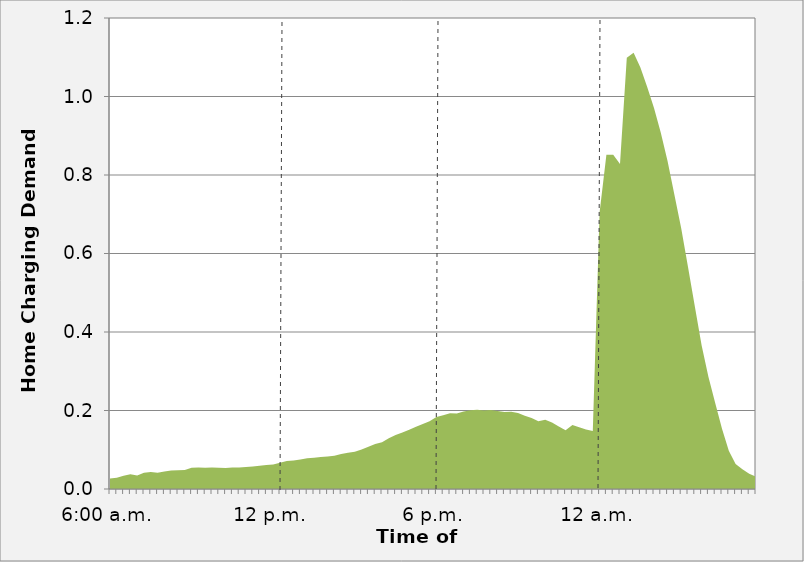
| Category | Total Home Charging Demand (Megawatts) |
|---|---|
| 6:00 a.m. | 0.027 |
| 6:15 | 0.029 |
| 6:30 | 0.034 |
| 6:45 | 0.038 |
| 7:00 | 0.035 |
| 7:15 | 0.041 |
| 7:30 | 0.043 |
| 7:45 | 0.041 |
| 8:00 | 0.045 |
| 8:15 | 0.047 |
| 8:30 | 0.048 |
| 8:45 | 0.049 |
| 9:00 | 0.054 |
| 9:15 | 0.055 |
| 9:30 | 0.054 |
| 9:45 | 0.055 |
| 10:00 | 0.054 |
| 10:15 | 0.053 |
| 10:30 | 0.055 |
| 10:45 | 0.055 |
| 11:00 | 0.056 |
| 11:15 | 0.058 |
| 11:30 | 0.059 |
| 11:45 | 0.061 |
| 12 p.m. | 0.062 |
| 12:15 | 0.067 |
| 12:30 | 0.071 |
| 12:45 | 0.073 |
| 13:00 | 0.075 |
| 13:15 | 0.078 |
| 13:30 | 0.079 |
| 13:45 | 0.082 |
| 14:00 | 0.083 |
| 14:15 | 0.085 |
| 14:30 | 0.089 |
| 14:45 | 0.092 |
| 15:00 | 0.095 |
| 15:15 | 0.101 |
| 15:30 | 0.108 |
| 15:45 | 0.115 |
| 16:00 | 0.119 |
| 16:15 | 0.129 |
| 16:30 | 0.138 |
| 16:45 | 0.144 |
| 17:00 | 0.151 |
| 17:15 | 0.159 |
| 17:30 | 0.166 |
| 17:45 | 0.173 |
| 6 p.m. | 0.183 |
| 18:15 | 0.188 |
| 18:30 | 0.193 |
| 18:45 | 0.192 |
| 19:00 | 0.198 |
| 19:15 | 0.201 |
| 19:30 | 0.202 |
| 19:45 | 0.2 |
| 20:00 | 0.201 |
| 20:15 | 0.198 |
| 20:30 | 0.196 |
| 20:45 | 0.197 |
| 21:00 | 0.193 |
| 21:15 | 0.186 |
| 21:30 | 0.181 |
| 21:45 | 0.172 |
| 22:00 | 0.176 |
| 22:15 | 0.169 |
| 22:30 | 0.159 |
| 22:45 | 0.15 |
| 23:00 | 0.163 |
| 23:15 | 0.157 |
| 23:30 | 0.152 |
| 23:45 | 0.147 |
| 12 a.m. | 0.705 |
| 0:15 | 0.851 |
| 0:30 | 0.851 |
| 0:45 | 0.828 |
| 1:00 | 1.099 |
| 1:15 | 1.111 |
| 1:30 | 1.074 |
| 1:45 | 1.024 |
| 2:00 | 0.971 |
| 2:15 | 0.907 |
| 2:30 | 0.835 |
| 2:45 | 0.75 |
| 3:00 | 0.665 |
| 3:15 | 0.566 |
| 3:30 | 0.465 |
| 3:45 | 0.366 |
| 4:00 | 0.286 |
| 4:15 | 0.219 |
| 4:30 | 0.153 |
| 4:45 | 0.097 |
| 5:00 | 0.064 |
| 5:15 | 0.05 |
| 5:30 | 0.039 |
| 5:45 | 0.031 |